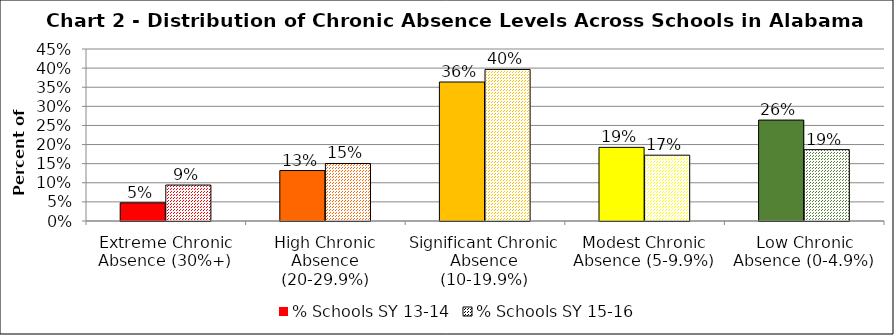
| Category | % Schools SY 13-14 | % Schools SY 15-16 |
|---|---|---|
| Extreme Chronic Absence (30%+) | 0.048 | 0.094 |
| High Chronic Absence (20-29.9%) | 0.132 | 0.151 |
| Significant Chronic Absence (10-19.9%) | 0.364 | 0.397 |
| Modest Chronic Absence (5-9.9%) | 0.193 | 0.172 |
| Low Chronic Absence (0-4.9%) | 0.264 | 0.187 |